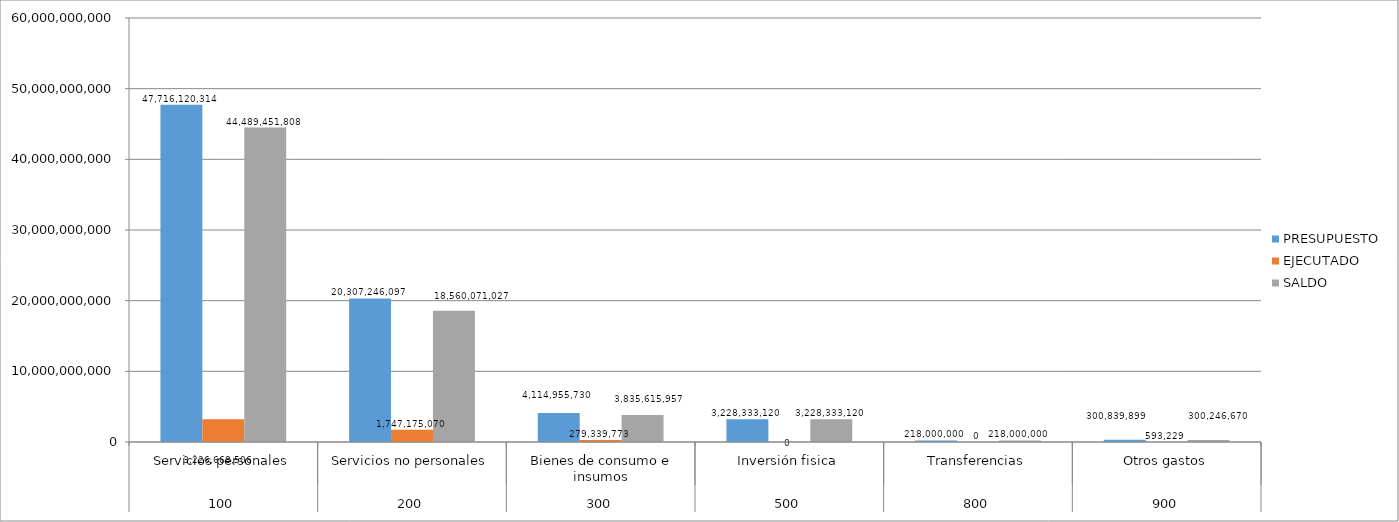
| Category | PRESUPUESTO | EJECUTADO | SALDO |
|---|---|---|---|
| 0 | 47716120314 | 3226668506 | 44489451808 |
| 1 | 20307246097 | 1747175070 | 18560071027 |
| 2 | 4114955730 | 279339773 | 3835615957 |
| 3 | 3228333120 | 0 | 3228333120 |
| 4 | 218000000 | 0 | 218000000 |
| 5 | 300839899 | 593229 | 300246670 |